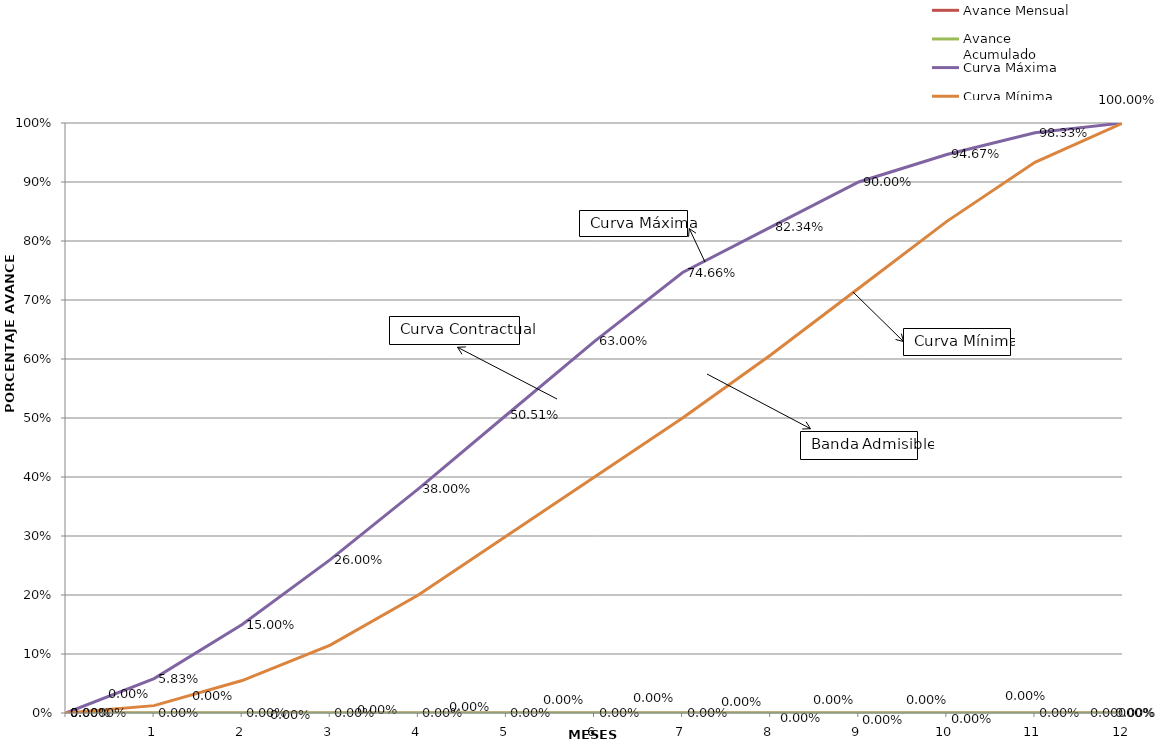
| Category | Avance Mensual | Avance Acumulado | Curva Máxima | Curva Mínima |
|---|---|---|---|---|
| nan | 0 | 0 | 0 | 0 |
| 1.0 | 0 | 0 | 0.058 | 0.012 |
| 2.0 | 0 | 0 | 0.15 | 0.055 |
| 3.0 | 0 | 0 | 0.26 | 0.115 |
| 4.0 | 0 | 0 | 0.38 | 0.2 |
| 5.0 | 0 | 0 | 0.505 | 0.3 |
| 6.0 | 0 | 0 | 0.63 | 0.4 |
| 7.0 | 0 | 0 | 0.747 | 0.5 |
| 8.0 | 0 | 0 | 0.823 | 0.607 |
| 9.0 | 0 | 0 | 0.9 | 0.72 |
| 10.0 | 0 | 0 | 0.947 | 0.833 |
| 11.0 | 0 | 0 | 0.983 | 0.933 |
| 12.0 | 0 | 0 | 1 | 1 |